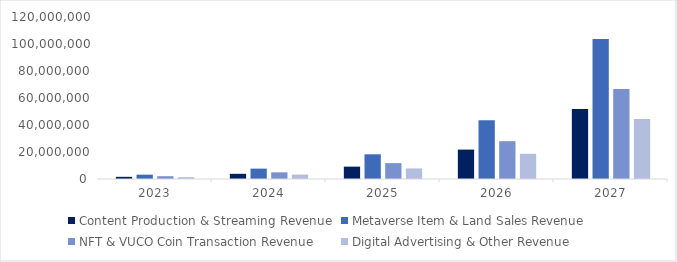
| Category | Content Production & Streaming Revenue | Metaverse Item & Land Sales Revenue | NFT & VUCO Coin Transaction Revenue | Digital Advertising & Other Revenue |
|---|---|---|---|---|
| 2023-12-01 | 1612076.199 | 3224152.398 | 2072669.399 | 1381779.599 |
| 2024-12-01 | 3839610.203 | 7679220.405 | 4936641.689 | 3291094.459 |
| 2025-12-01 | 9145105.249 | 18290210.497 | 11757992.462 | 7838661.642 |
| 2026-12-01 | 21781625.112 | 43563250.224 | 28004946.573 | 18669964.382 |
| 2027-12-01 | 51879030.326 | 103758060.651 | 66701610.419 | 44467740.279 |